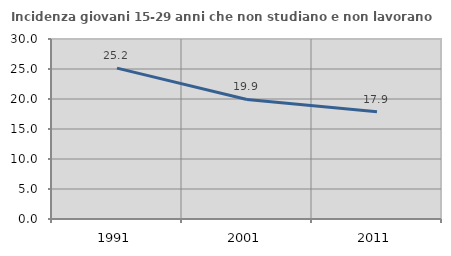
| Category | Incidenza giovani 15-29 anni che non studiano e non lavorano  |
|---|---|
| 1991.0 | 25.152 |
| 2001.0 | 19.926 |
| 2011.0 | 17.874 |